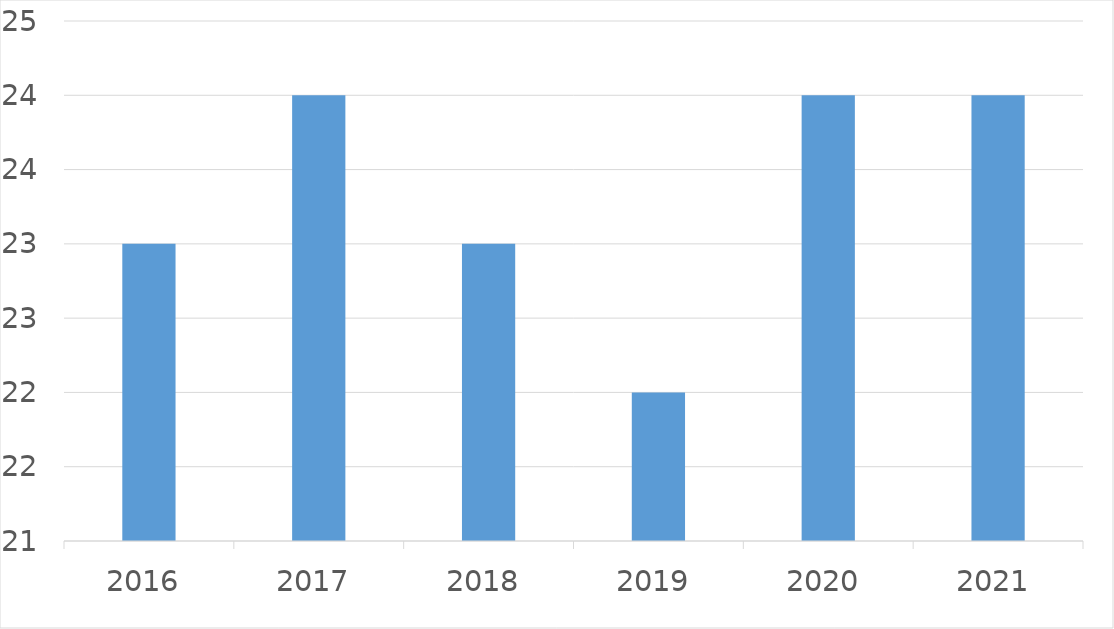
| Category | Series 0 |
|---|---|
| 2016 | 23 |
| 2017 | 24 |
| 2018 | 23 |
| 2019 | 22 |
| 2020 | 24 |
| 2021 | 24 |